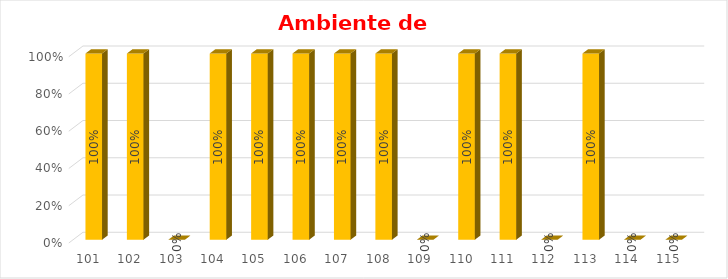
| Category | % Avance |
|---|---|
| 101.0 | 1 |
| 102.0 | 1 |
| 103.0 | 0 |
| 104.0 | 1 |
| 105.0 | 1 |
| 106.0 | 1 |
| 107.0 | 1 |
| 108.0 | 1 |
| 109.0 | 0 |
| 110.0 | 1 |
| 111.0 | 1 |
| 112.0 | 0 |
| 113.0 | 1 |
| 114.0 | 0 |
| 115.0 | 0 |